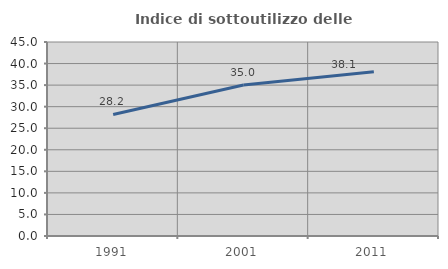
| Category | Indice di sottoutilizzo delle abitazioni  |
|---|---|
| 1991.0 | 28.184 |
| 2001.0 | 35.025 |
| 2011.0 | 38.1 |